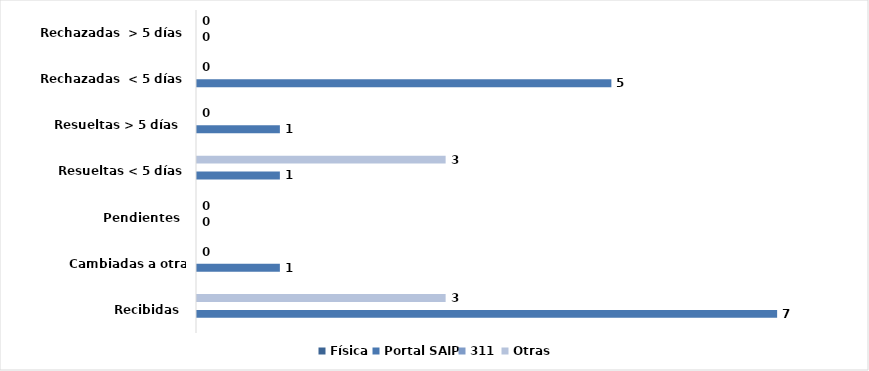
| Category | Física | Portal SAIP | 311 | Otras |
|---|---|---|---|---|
| Recibidas  | 0 | 7 | 0 | 3 |
| Cambiadas a otra Institución | 0 | 1 | 0 | 0 |
| Pendientes  | 0 | 0 | 0 | 0 |
| Resueltas < 5 días | 0 | 1 | 0 | 3 |
| Resueltas > 5 días  | 0 | 1 | 0 | 0 |
| Rechazadas  < 5 días | 0 | 5 | 0 | 0 |
| Rechazadas  > 5 días | 0 | 0 | 0 | 0 |